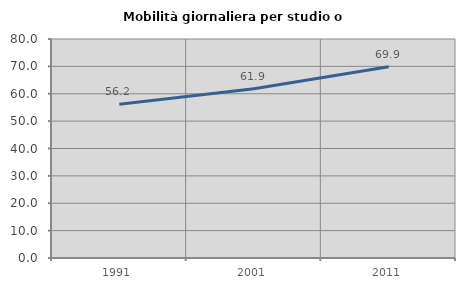
| Category | Mobilità giornaliera per studio o lavoro |
|---|---|
| 1991.0 | 56.197 |
| 2001.0 | 61.864 |
| 2011.0 | 69.868 |